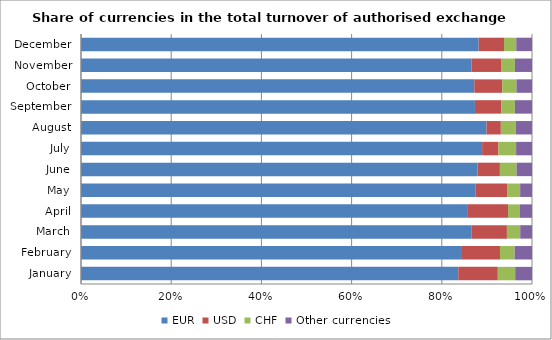
| Category | EUR | USD | CHF | Other currencies |
|---|---|---|---|---|
| January | 83.653 | 8.768 | 3.852 | 3.728 |
| February | 84.472 | 8.428 | 3.252 | 3.848 |
| March | 86.551 | 7.887 | 2.952 | 2.61 |
| April | 85.788 | 8.902 | 2.65 | 2.661 |
| May | 87.518 | 6.947 | 2.904 | 2.631 |
| June | 87.925 | 4.958 | 3.693 | 3.424 |
| July | 88.941 | 3.618 | 3.919 | 3.522 |
| August | 89.917 | 3.173 | 3.316 | 3.594 |
| September | 87.349 | 5.896 | 2.964 | 3.79 |
| October | 87.206 | 6.185 | 3.165 | 3.444 |
| November | 86.613 | 6.521 | 3.083 | 3.783 |
| December | 88.171 | 5.616 | 2.723 | 3.49 |